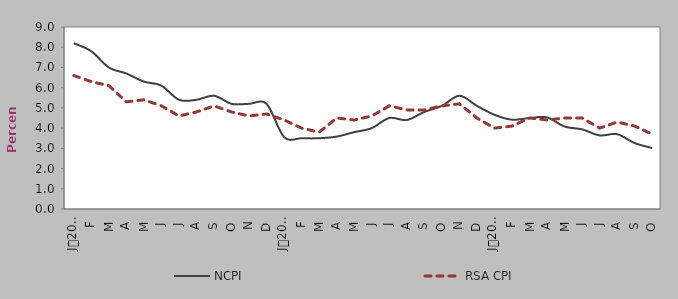
| Category | NCPI | RSA CPI |
|---|---|---|
| 0 | 8.2 | 6.6 |
| 1900-01-01 | 7.8 | 6.3 |
| 1900-01-02 | 7 | 6.1 |
| 1900-01-03 | 6.7 | 5.3 |
| 1900-01-04 | 6.3 | 5.4 |
| 1900-01-05 | 6.1 | 5.1 |
| 1900-01-06 | 5.4 | 4.6 |
| 1900-01-07 | 5.4 | 4.8 |
| 1900-01-08 | 5.6 | 5.1 |
| 1900-01-09 | 5.2 | 4.8 |
| 1900-01-10 | 5.2 | 4.6 |
| 1900-01-11 | 5.2 | 4.7 |
| 1900-01-12 | 3.555 | 4.4 |
| 1900-01-13 | 3.5 | 4 |
| 1900-01-14 | 3.5 | 3.8 |
| 1900-01-15 | 3.581 | 4.5 |
| 1900-01-16 | 3.8 | 4.4 |
| 1900-01-17 | 4 | 4.6 |
| 1900-01-18 | 4.5 | 5.1 |
| 1900-01-19 | 4.4 | 4.9 |
| 1900-01-20 | 4.8 | 4.9 |
| 1900-01-21 | 5.1 | 5.1 |
| 1900-01-22 | 5.6 | 5.2 |
| 1900-01-23 | 5.1 | 4.5 |
| 1900-01-24 | 4.658 | 4 |
| 1900-01-25 | 4.416 | 4.1 |
| 1900-01-26 | 4.498 | 4.5 |
| 1900-01-27 | 4.529 | 4.4 |
| 1900-01-28 | 4.076 | 4.5 |
| 1900-01-29 | 3.939 | 4.5 |
| 1900-01-30 | 3.639 | 4 |
| 1900-01-31 | 3.7 | 4.3 |
| 1900-02-01 | 3.259 | 4.1 |
| 1900-02-02 | 3.015 | 3.7 |